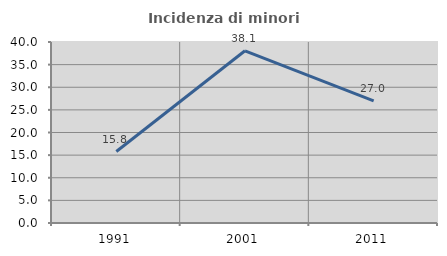
| Category | Incidenza di minori stranieri |
|---|---|
| 1991.0 | 15.789 |
| 2001.0 | 38.06 |
| 2011.0 | 27.01 |